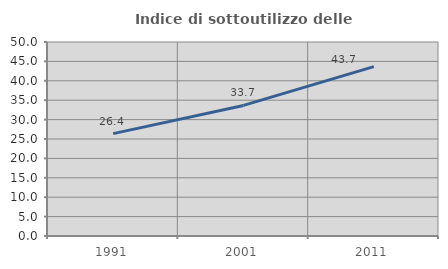
| Category | Indice di sottoutilizzo delle abitazioni  |
|---|---|
| 1991.0 | 26.389 |
| 2001.0 | 33.654 |
| 2011.0 | 43.667 |